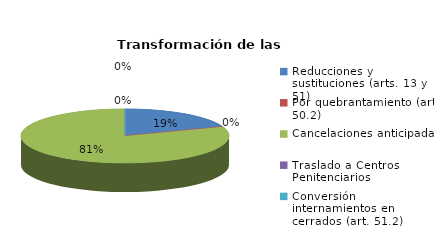
| Category | Series 0 |
|---|---|
| Reducciones y sustituciones (arts. 13 y 51) | 7 |
| Por quebrantamiento (art. 50.2) | 0 |
| Cancelaciones anticipadas | 29 |
| Traslado a Centros Penitenciarios | 0 |
| Conversión internamientos en cerrados (art. 51.2) | 0 |